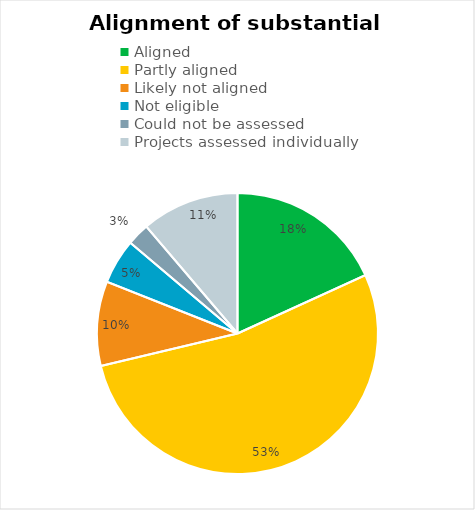
| Category | Series 0 |
|---|---|
| Aligned | 0.182 |
| Partly aligned | 0.531 |
| Likely not aligned | 0.097 |
| Not eligible  | 0.052 |
| Could not be assessed  | 0.026 |
| Projects assessed individually  | 0.112 |